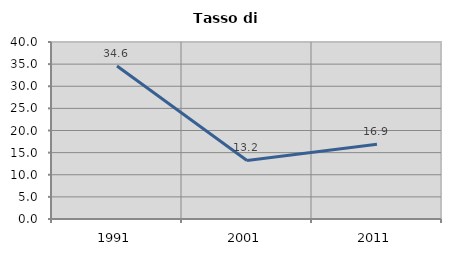
| Category | Tasso di disoccupazione   |
|---|---|
| 1991.0 | 34.584 |
| 2001.0 | 13.224 |
| 2011.0 | 16.872 |